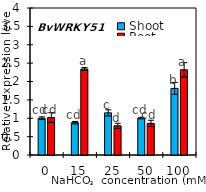
| Category | Shoot | Root |
|---|---|---|
| 0.0 | 1.001 | 1.019 |
| 15.0 | 0.88 | 2.341 |
| 25.0 | 1.147 | 0.794 |
| 50.0 | 1.005 | 0.861 |
| 100.0 | 1.812 | 2.319 |